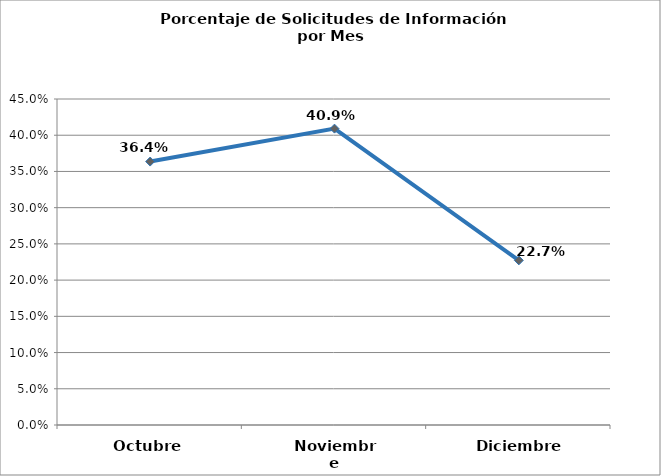
| Category | Series 0 |
|---|---|
| Octubre | 0.364 |
| Noviembre | 0.409 |
| Diciembre | 0.227 |